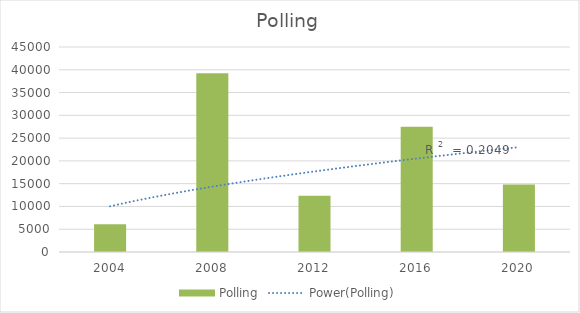
| Category | Polling |
|---|---|
| 2004.0 | 6092 |
| 2008.0 | 39221 |
| 2012.0 | 12323 |
| 2016.0 | 27513 |
| 2020.0 | 14835 |